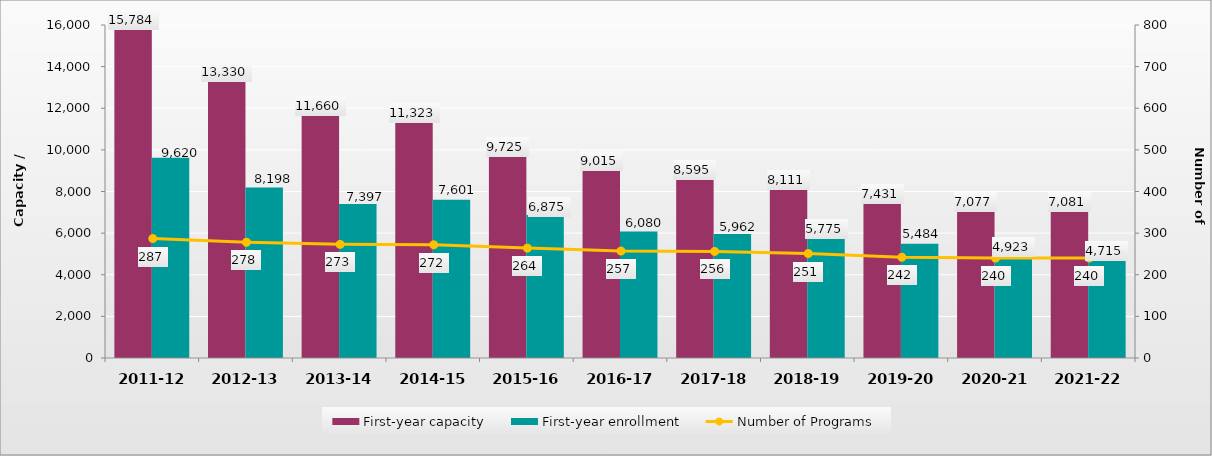
| Category | First-year capacity | First-year enrollment |
|---|---|---|
| 2011-12 | 15784 | 9620 |
| 2012-13 | 13330 | 8198 |
| 2013-14 | 11660 | 7397 |
| 2014-15 | 11323 | 7601 |
| 2015-16 | 9725 | 6875 |
| 2016-17 | 9015 | 6080 |
| 2017-18 | 8595 | 5962 |
| 2018-19 | 8111 | 5775 |
| 2019-20 | 7431 | 5484 |
| 2020-21 | 7077 | 4923 |
| 2021-22 | 7081 | 4715 |